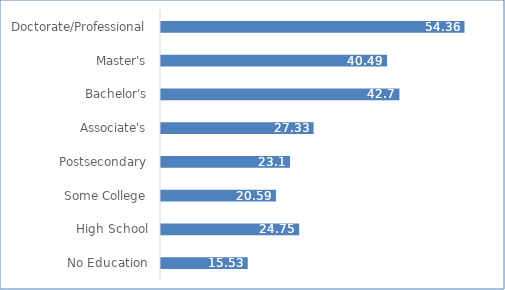
| Category | Series 0 |
|---|---|
| No Education | 15.53 |
| High School | 24.75 |
| Some College | 20.59 |
| Postsecondary | 23.1 |
| Associate's | 27.33 |
| Bachelor's | 42.7 |
| Master's | 40.49 |
| Doctorate/Professional | 54.36 |